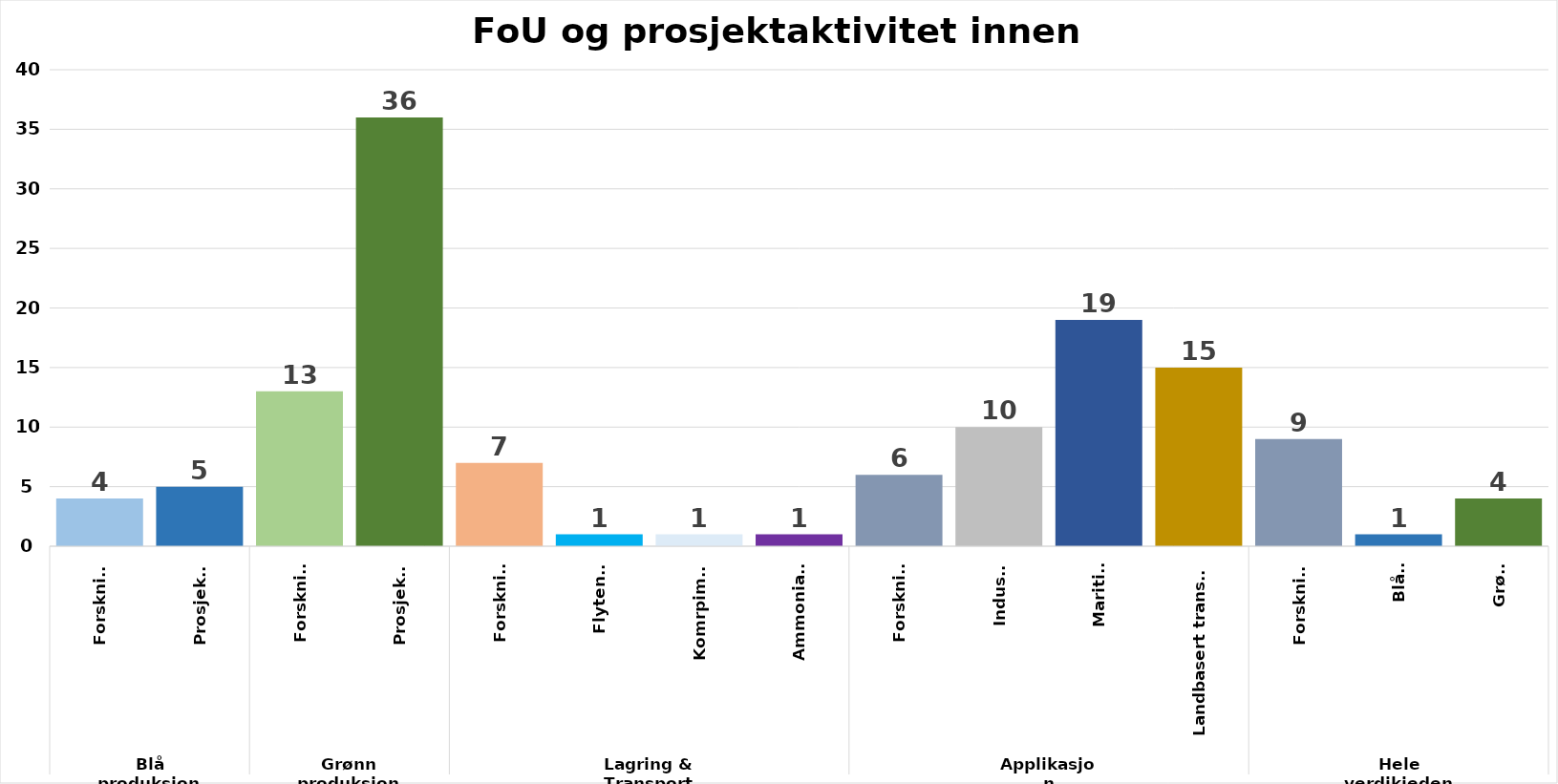
| Category | Series 0 |
|---|---|
| 0 | 4 |
| 1 | 5 |
| 2 | 13 |
| 3 | 36 |
| 4 | 7 |
| 5 | 1 |
| 6 | 1 |
| 7 | 1 |
| 8 | 6 |
| 9 | 10 |
| 10 | 19 |
| 11 | 15 |
| 12 | 9 |
| 13 | 1 |
| 14 | 4 |